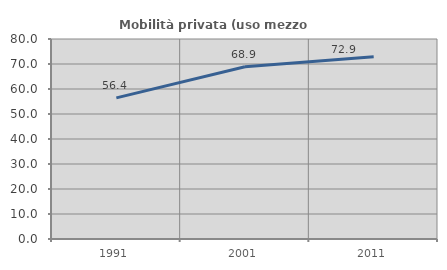
| Category | Mobilità privata (uso mezzo privato) |
|---|---|
| 1991.0 | 56.441 |
| 2001.0 | 68.888 |
| 2011.0 | 72.879 |